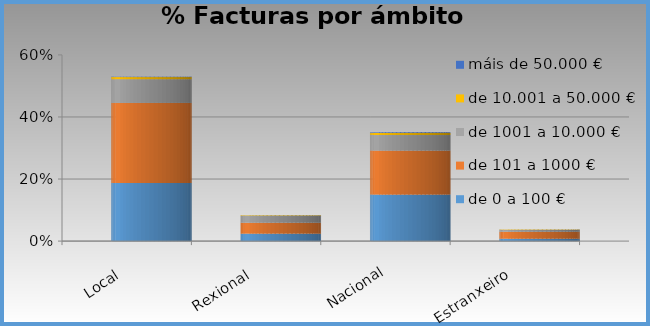
| Category | de 0 a 100 € | de 101 a 1000 € | de 1001 a 10.000 € | de 10.001 a 50.000 € | máis de 50.000 € |
|---|---|---|---|---|---|
| Local | 0.187 | 0.258 | 0.077 | 0.007 | 0.001 |
| Rexional | 0.024 | 0.035 | 0.023 | 0.001 | 0 |
| Nacional | 0.15 | 0.142 | 0.05 | 0.007 | 0.002 |
| Estranxeiro | 0.008 | 0.022 | 0.006 | 0.001 | 0 |